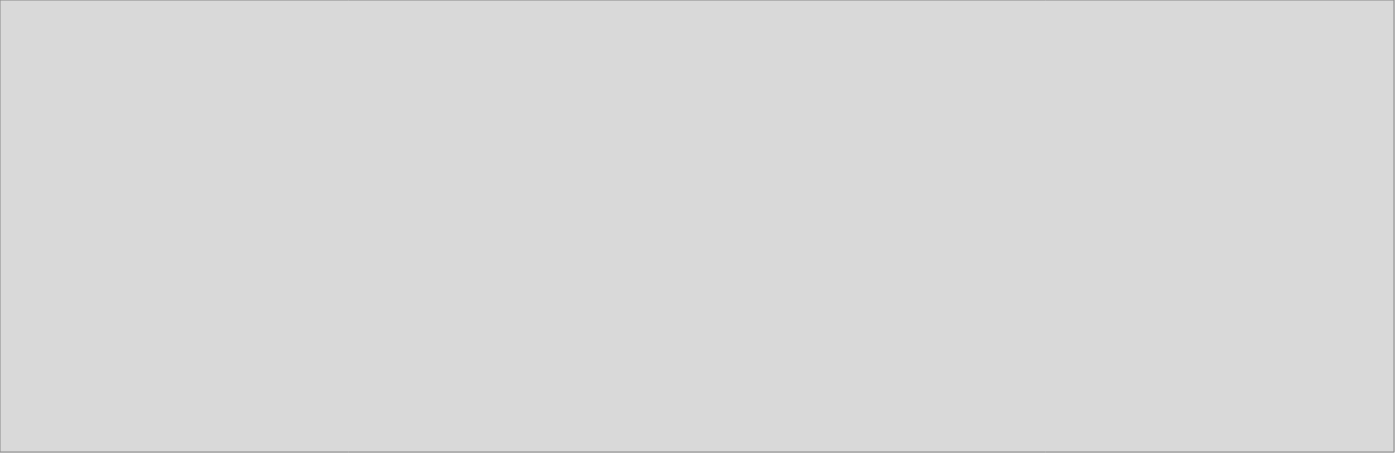
| Category | Comercio al por mayor y al por menor |
|---|---|
| 2018_I | 34927.597 |
| 2018_II | 35087.996 |
| 2018_III | 38408.822 |
| 2018_IV | 44157.399 |
| 2019_I | 38868.289 |
| 2019_II | 38761.254 |
| 2019_III | 0 |
| 2019_IV | 0 |